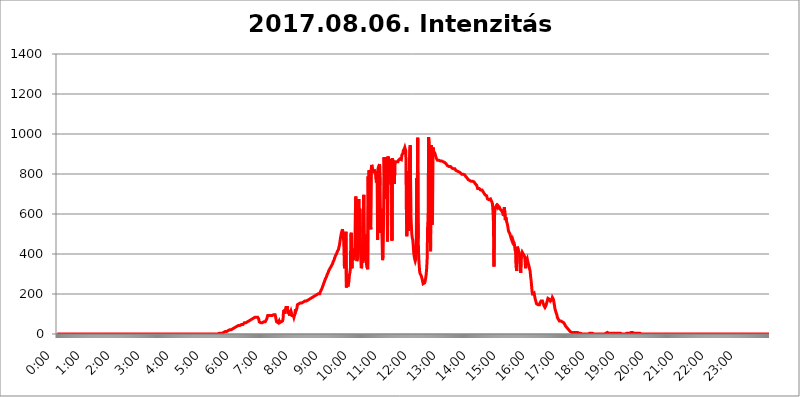
| Category | 2017.08.06. Intenzitás [W/m^2] |
|---|---|
| 0.0 | 0 |
| 0.0006944444444444445 | 0 |
| 0.001388888888888889 | 0 |
| 0.0020833333333333333 | 0 |
| 0.002777777777777778 | 0 |
| 0.003472222222222222 | 0 |
| 0.004166666666666667 | 0 |
| 0.004861111111111111 | 0 |
| 0.005555555555555556 | 0 |
| 0.0062499999999999995 | 0 |
| 0.006944444444444444 | 0 |
| 0.007638888888888889 | 0 |
| 0.008333333333333333 | 0 |
| 0.009027777777777779 | 0 |
| 0.009722222222222222 | 0 |
| 0.010416666666666666 | 0 |
| 0.011111111111111112 | 0 |
| 0.011805555555555555 | 0 |
| 0.012499999999999999 | 0 |
| 0.013194444444444444 | 0 |
| 0.013888888888888888 | 0 |
| 0.014583333333333332 | 0 |
| 0.015277777777777777 | 0 |
| 0.015972222222222224 | 0 |
| 0.016666666666666666 | 0 |
| 0.017361111111111112 | 0 |
| 0.018055555555555557 | 0 |
| 0.01875 | 0 |
| 0.019444444444444445 | 0 |
| 0.02013888888888889 | 0 |
| 0.020833333333333332 | 0 |
| 0.02152777777777778 | 0 |
| 0.022222222222222223 | 0 |
| 0.02291666666666667 | 0 |
| 0.02361111111111111 | 0 |
| 0.024305555555555556 | 0 |
| 0.024999999999999998 | 0 |
| 0.025694444444444447 | 0 |
| 0.02638888888888889 | 0 |
| 0.027083333333333334 | 0 |
| 0.027777777777777776 | 0 |
| 0.02847222222222222 | 0 |
| 0.029166666666666664 | 0 |
| 0.029861111111111113 | 0 |
| 0.030555555555555555 | 0 |
| 0.03125 | 0 |
| 0.03194444444444445 | 0 |
| 0.03263888888888889 | 0 |
| 0.03333333333333333 | 0 |
| 0.034027777777777775 | 0 |
| 0.034722222222222224 | 0 |
| 0.035416666666666666 | 0 |
| 0.036111111111111115 | 0 |
| 0.03680555555555556 | 0 |
| 0.0375 | 0 |
| 0.03819444444444444 | 0 |
| 0.03888888888888889 | 0 |
| 0.03958333333333333 | 0 |
| 0.04027777777777778 | 0 |
| 0.04097222222222222 | 0 |
| 0.041666666666666664 | 0 |
| 0.042361111111111106 | 0 |
| 0.04305555555555556 | 0 |
| 0.043750000000000004 | 0 |
| 0.044444444444444446 | 0 |
| 0.04513888888888889 | 0 |
| 0.04583333333333334 | 0 |
| 0.04652777777777778 | 0 |
| 0.04722222222222222 | 0 |
| 0.04791666666666666 | 0 |
| 0.04861111111111111 | 0 |
| 0.049305555555555554 | 0 |
| 0.049999999999999996 | 0 |
| 0.05069444444444445 | 0 |
| 0.051388888888888894 | 0 |
| 0.052083333333333336 | 0 |
| 0.05277777777777778 | 0 |
| 0.05347222222222222 | 0 |
| 0.05416666666666667 | 0 |
| 0.05486111111111111 | 0 |
| 0.05555555555555555 | 0 |
| 0.05625 | 0 |
| 0.05694444444444444 | 0 |
| 0.057638888888888885 | 0 |
| 0.05833333333333333 | 0 |
| 0.05902777777777778 | 0 |
| 0.059722222222222225 | 0 |
| 0.06041666666666667 | 0 |
| 0.061111111111111116 | 0 |
| 0.06180555555555556 | 0 |
| 0.0625 | 0 |
| 0.06319444444444444 | 0 |
| 0.06388888888888888 | 0 |
| 0.06458333333333334 | 0 |
| 0.06527777777777778 | 0 |
| 0.06597222222222222 | 0 |
| 0.06666666666666667 | 0 |
| 0.06736111111111111 | 0 |
| 0.06805555555555555 | 0 |
| 0.06874999999999999 | 0 |
| 0.06944444444444443 | 0 |
| 0.07013888888888889 | 0 |
| 0.07083333333333333 | 0 |
| 0.07152777777777779 | 0 |
| 0.07222222222222223 | 0 |
| 0.07291666666666667 | 0 |
| 0.07361111111111111 | 0 |
| 0.07430555555555556 | 0 |
| 0.075 | 0 |
| 0.07569444444444444 | 0 |
| 0.0763888888888889 | 0 |
| 0.07708333333333334 | 0 |
| 0.07777777777777778 | 0 |
| 0.07847222222222222 | 0 |
| 0.07916666666666666 | 0 |
| 0.0798611111111111 | 0 |
| 0.08055555555555556 | 0 |
| 0.08125 | 0 |
| 0.08194444444444444 | 0 |
| 0.08263888888888889 | 0 |
| 0.08333333333333333 | 0 |
| 0.08402777777777777 | 0 |
| 0.08472222222222221 | 0 |
| 0.08541666666666665 | 0 |
| 0.08611111111111112 | 0 |
| 0.08680555555555557 | 0 |
| 0.08750000000000001 | 0 |
| 0.08819444444444445 | 0 |
| 0.08888888888888889 | 0 |
| 0.08958333333333333 | 0 |
| 0.09027777777777778 | 0 |
| 0.09097222222222222 | 0 |
| 0.09166666666666667 | 0 |
| 0.09236111111111112 | 0 |
| 0.09305555555555556 | 0 |
| 0.09375 | 0 |
| 0.09444444444444444 | 0 |
| 0.09513888888888888 | 0 |
| 0.09583333333333333 | 0 |
| 0.09652777777777777 | 0 |
| 0.09722222222222222 | 0 |
| 0.09791666666666667 | 0 |
| 0.09861111111111111 | 0 |
| 0.09930555555555555 | 0 |
| 0.09999999999999999 | 0 |
| 0.10069444444444443 | 0 |
| 0.1013888888888889 | 0 |
| 0.10208333333333335 | 0 |
| 0.10277777777777779 | 0 |
| 0.10347222222222223 | 0 |
| 0.10416666666666667 | 0 |
| 0.10486111111111111 | 0 |
| 0.10555555555555556 | 0 |
| 0.10625 | 0 |
| 0.10694444444444444 | 0 |
| 0.1076388888888889 | 0 |
| 0.10833333333333334 | 0 |
| 0.10902777777777778 | 0 |
| 0.10972222222222222 | 0 |
| 0.1111111111111111 | 0 |
| 0.11180555555555556 | 0 |
| 0.11180555555555556 | 0 |
| 0.1125 | 0 |
| 0.11319444444444444 | 0 |
| 0.11388888888888889 | 0 |
| 0.11458333333333333 | 0 |
| 0.11527777777777777 | 0 |
| 0.11597222222222221 | 0 |
| 0.11666666666666665 | 0 |
| 0.1173611111111111 | 0 |
| 0.11805555555555557 | 0 |
| 0.11944444444444445 | 0 |
| 0.12013888888888889 | 0 |
| 0.12083333333333333 | 0 |
| 0.12152777777777778 | 0 |
| 0.12222222222222223 | 0 |
| 0.12291666666666667 | 0 |
| 0.12291666666666667 | 0 |
| 0.12361111111111112 | 0 |
| 0.12430555555555556 | 0 |
| 0.125 | 0 |
| 0.12569444444444444 | 0 |
| 0.12638888888888888 | 0 |
| 0.12708333333333333 | 0 |
| 0.16875 | 0 |
| 0.12847222222222224 | 0 |
| 0.12916666666666668 | 0 |
| 0.12986111111111112 | 0 |
| 0.13055555555555556 | 0 |
| 0.13125 | 0 |
| 0.13194444444444445 | 0 |
| 0.1326388888888889 | 0 |
| 0.13333333333333333 | 0 |
| 0.13402777777777777 | 0 |
| 0.13402777777777777 | 0 |
| 0.13472222222222222 | 0 |
| 0.13541666666666666 | 0 |
| 0.1361111111111111 | 0 |
| 0.13749999999999998 | 0 |
| 0.13819444444444443 | 0 |
| 0.1388888888888889 | 0 |
| 0.13958333333333334 | 0 |
| 0.14027777777777778 | 0 |
| 0.14097222222222222 | 0 |
| 0.14166666666666666 | 0 |
| 0.1423611111111111 | 0 |
| 0.14305555555555557 | 0 |
| 0.14375000000000002 | 0 |
| 0.14444444444444446 | 0 |
| 0.1451388888888889 | 0 |
| 0.1451388888888889 | 0 |
| 0.14652777777777778 | 0 |
| 0.14722222222222223 | 0 |
| 0.14791666666666667 | 0 |
| 0.1486111111111111 | 0 |
| 0.14930555555555555 | 0 |
| 0.15 | 0 |
| 0.15069444444444444 | 0 |
| 0.15138888888888888 | 0 |
| 0.15208333333333332 | 0 |
| 0.15277777777777776 | 0 |
| 0.15347222222222223 | 0 |
| 0.15416666666666667 | 0 |
| 0.15486111111111112 | 0 |
| 0.15555555555555556 | 0 |
| 0.15625 | 0 |
| 0.15694444444444444 | 0 |
| 0.15763888888888888 | 0 |
| 0.15833333333333333 | 0 |
| 0.15902777777777777 | 0 |
| 0.15972222222222224 | 0 |
| 0.16041666666666668 | 0 |
| 0.16111111111111112 | 0 |
| 0.16180555555555556 | 0 |
| 0.1625 | 0 |
| 0.16319444444444445 | 0 |
| 0.1638888888888889 | 0 |
| 0.16458333333333333 | 0 |
| 0.16527777777777777 | 0 |
| 0.16597222222222222 | 0 |
| 0.16666666666666666 | 0 |
| 0.1673611111111111 | 0 |
| 0.16805555555555554 | 0 |
| 0.16874999999999998 | 0 |
| 0.16944444444444443 | 0 |
| 0.17013888888888887 | 0 |
| 0.1708333333333333 | 0 |
| 0.17152777777777775 | 0 |
| 0.17222222222222225 | 0 |
| 0.1729166666666667 | 0 |
| 0.17361111111111113 | 0 |
| 0.17430555555555557 | 0 |
| 0.17500000000000002 | 0 |
| 0.17569444444444446 | 0 |
| 0.1763888888888889 | 0 |
| 0.17708333333333334 | 0 |
| 0.17777777777777778 | 0 |
| 0.17847222222222223 | 0 |
| 0.17916666666666667 | 0 |
| 0.1798611111111111 | 0 |
| 0.18055555555555555 | 0 |
| 0.18125 | 0 |
| 0.18194444444444444 | 0 |
| 0.1826388888888889 | 0 |
| 0.18333333333333335 | 0 |
| 0.1840277777777778 | 0 |
| 0.18472222222222223 | 0 |
| 0.18541666666666667 | 0 |
| 0.18611111111111112 | 0 |
| 0.18680555555555556 | 0 |
| 0.1875 | 0 |
| 0.18819444444444444 | 0 |
| 0.18888888888888888 | 0 |
| 0.18958333333333333 | 0 |
| 0.19027777777777777 | 0 |
| 0.1909722222222222 | 0 |
| 0.19166666666666665 | 0 |
| 0.19236111111111112 | 0 |
| 0.19305555555555554 | 0 |
| 0.19375 | 0 |
| 0.19444444444444445 | 0 |
| 0.1951388888888889 | 0 |
| 0.19583333333333333 | 0 |
| 0.19652777777777777 | 0 |
| 0.19722222222222222 | 0 |
| 0.19791666666666666 | 0 |
| 0.1986111111111111 | 0 |
| 0.19930555555555554 | 0 |
| 0.19999999999999998 | 0 |
| 0.20069444444444443 | 0 |
| 0.20138888888888887 | 0 |
| 0.2020833333333333 | 0 |
| 0.2027777777777778 | 0 |
| 0.2034722222222222 | 0 |
| 0.2041666666666667 | 0 |
| 0.20486111111111113 | 0 |
| 0.20555555555555557 | 0 |
| 0.20625000000000002 | 0 |
| 0.20694444444444446 | 0 |
| 0.2076388888888889 | 0 |
| 0.20833333333333334 | 0 |
| 0.20902777777777778 | 0 |
| 0.20972222222222223 | 0 |
| 0.21041666666666667 | 0 |
| 0.2111111111111111 | 0 |
| 0.21180555555555555 | 0 |
| 0.2125 | 0 |
| 0.21319444444444444 | 0 |
| 0.2138888888888889 | 0 |
| 0.21458333333333335 | 0 |
| 0.2152777777777778 | 0 |
| 0.21597222222222223 | 0 |
| 0.21666666666666667 | 0 |
| 0.21736111111111112 | 0 |
| 0.21805555555555556 | 0 |
| 0.21875 | 0 |
| 0.21944444444444444 | 0 |
| 0.22013888888888888 | 0 |
| 0.22083333333333333 | 0 |
| 0.22152777777777777 | 0 |
| 0.2222222222222222 | 0 |
| 0.22291666666666665 | 0 |
| 0.2236111111111111 | 0 |
| 0.22430555555555556 | 0 |
| 0.225 | 0 |
| 0.22569444444444445 | 0 |
| 0.2263888888888889 | 3.525 |
| 0.22708333333333333 | 3.525 |
| 0.22777777777777777 | 3.525 |
| 0.22847222222222222 | 3.525 |
| 0.22916666666666666 | 3.525 |
| 0.2298611111111111 | 3.525 |
| 0.23055555555555554 | 3.525 |
| 0.23124999999999998 | 3.525 |
| 0.23194444444444443 | 3.525 |
| 0.23263888888888887 | 7.887 |
| 0.2333333333333333 | 7.887 |
| 0.2340277777777778 | 7.887 |
| 0.2347222222222222 | 7.887 |
| 0.2354166666666667 | 12.257 |
| 0.23611111111111113 | 12.257 |
| 0.23680555555555557 | 12.257 |
| 0.23750000000000002 | 12.257 |
| 0.23819444444444446 | 12.257 |
| 0.2388888888888889 | 12.257 |
| 0.23958333333333334 | 16.636 |
| 0.24027777777777778 | 16.636 |
| 0.24097222222222223 | 16.636 |
| 0.24166666666666667 | 21.024 |
| 0.2423611111111111 | 21.024 |
| 0.24305555555555555 | 21.024 |
| 0.24375 | 21.024 |
| 0.24444444444444446 | 21.024 |
| 0.24513888888888888 | 25.419 |
| 0.24583333333333335 | 25.419 |
| 0.2465277777777778 | 25.419 |
| 0.24722222222222223 | 25.419 |
| 0.24791666666666667 | 29.823 |
| 0.24861111111111112 | 29.823 |
| 0.24930555555555556 | 34.234 |
| 0.25 | 34.234 |
| 0.25069444444444444 | 34.234 |
| 0.2513888888888889 | 38.653 |
| 0.2520833333333333 | 38.653 |
| 0.25277777777777777 | 38.653 |
| 0.2534722222222222 | 43.079 |
| 0.25416666666666665 | 43.079 |
| 0.2548611111111111 | 43.079 |
| 0.2555555555555556 | 43.079 |
| 0.25625000000000003 | 43.079 |
| 0.2569444444444445 | 47.511 |
| 0.2576388888888889 | 47.511 |
| 0.25833333333333336 | 47.511 |
| 0.2590277777777778 | 47.511 |
| 0.25972222222222224 | 47.511 |
| 0.2604166666666667 | 47.511 |
| 0.2611111111111111 | 51.951 |
| 0.26180555555555557 | 51.951 |
| 0.2625 | 56.398 |
| 0.26319444444444445 | 56.398 |
| 0.2638888888888889 | 56.398 |
| 0.26458333333333334 | 56.398 |
| 0.2652777777777778 | 60.85 |
| 0.2659722222222222 | 60.85 |
| 0.26666666666666666 | 60.85 |
| 0.2673611111111111 | 60.85 |
| 0.26805555555555555 | 65.31 |
| 0.26875 | 65.31 |
| 0.26944444444444443 | 65.31 |
| 0.2701388888888889 | 69.775 |
| 0.2708333333333333 | 69.775 |
| 0.27152777777777776 | 69.775 |
| 0.2722222222222222 | 74.246 |
| 0.27291666666666664 | 74.246 |
| 0.2736111111111111 | 74.246 |
| 0.2743055555555555 | 78.722 |
| 0.27499999999999997 | 78.722 |
| 0.27569444444444446 | 78.722 |
| 0.27638888888888885 | 83.205 |
| 0.27708333333333335 | 83.205 |
| 0.2777777777777778 | 83.205 |
| 0.27847222222222223 | 83.205 |
| 0.2791666666666667 | 83.205 |
| 0.2798611111111111 | 83.205 |
| 0.28055555555555556 | 83.205 |
| 0.28125 | 83.205 |
| 0.28194444444444444 | 83.205 |
| 0.2826388888888889 | 74.246 |
| 0.2833333333333333 | 60.85 |
| 0.28402777777777777 | 56.398 |
| 0.2847222222222222 | 56.398 |
| 0.28541666666666665 | 56.398 |
| 0.28611111111111115 | 56.398 |
| 0.28680555555555554 | 56.398 |
| 0.28750000000000003 | 56.398 |
| 0.2881944444444445 | 56.398 |
| 0.2888888888888889 | 56.398 |
| 0.28958333333333336 | 60.85 |
| 0.2902777777777778 | 60.85 |
| 0.29097222222222224 | 60.85 |
| 0.2916666666666667 | 60.85 |
| 0.2923611111111111 | 60.85 |
| 0.29305555555555557 | 60.85 |
| 0.29375 | 74.246 |
| 0.29444444444444445 | 69.775 |
| 0.2951388888888889 | 92.184 |
| 0.29583333333333334 | 92.184 |
| 0.2965277777777778 | 92.184 |
| 0.2972222222222222 | 92.184 |
| 0.29791666666666666 | 92.184 |
| 0.2986111111111111 | 92.184 |
| 0.29930555555555555 | 92.184 |
| 0.3 | 92.184 |
| 0.30069444444444443 | 92.184 |
| 0.3013888888888889 | 92.184 |
| 0.3020833333333333 | 96.682 |
| 0.30277777777777776 | 96.682 |
| 0.3034722222222222 | 96.682 |
| 0.30416666666666664 | 96.682 |
| 0.3048611111111111 | 96.682 |
| 0.3055555555555555 | 96.682 |
| 0.30624999999999997 | 92.184 |
| 0.3069444444444444 | 92.184 |
| 0.3076388888888889 | 60.85 |
| 0.30833333333333335 | 56.398 |
| 0.3090277777777778 | 56.398 |
| 0.30972222222222223 | 56.398 |
| 0.3104166666666667 | 56.398 |
| 0.3111111111111111 | 65.31 |
| 0.31180555555555556 | 56.398 |
| 0.3125 | 56.398 |
| 0.31319444444444444 | 60.85 |
| 0.3138888888888889 | 60.85 |
| 0.3145833333333333 | 65.31 |
| 0.31527777777777777 | 65.31 |
| 0.3159722222222222 | 65.31 |
| 0.31666666666666665 | 74.246 |
| 0.31736111111111115 | 110.201 |
| 0.31805555555555554 | 119.235 |
| 0.31875000000000003 | 101.184 |
| 0.3194444444444445 | 123.758 |
| 0.3201388888888889 | 114.716 |
| 0.32083333333333336 | 132.814 |
| 0.3215277777777778 | 132.814 |
| 0.32222222222222224 | 137.347 |
| 0.3229166666666667 | 132.814 |
| 0.3236111111111111 | 101.184 |
| 0.32430555555555557 | 110.201 |
| 0.325 | 119.235 |
| 0.32569444444444445 | 92.184 |
| 0.3263888888888889 | 92.184 |
| 0.32708333333333334 | 92.184 |
| 0.3277777777777778 | 114.716 |
| 0.3284722222222222 | 105.69 |
| 0.32916666666666666 | 92.184 |
| 0.3298611111111111 | 92.184 |
| 0.33055555555555555 | 87.692 |
| 0.33125 | 92.184 |
| 0.33194444444444443 | 83.205 |
| 0.3326388888888889 | 87.692 |
| 0.3333333333333333 | 101.184 |
| 0.3340277777777778 | 123.758 |
| 0.3347222222222222 | 114.716 |
| 0.3354166666666667 | 114.716 |
| 0.3361111111111111 | 128.284 |
| 0.3368055555555556 | 146.423 |
| 0.33749999999999997 | 146.423 |
| 0.33819444444444446 | 150.964 |
| 0.33888888888888885 | 150.964 |
| 0.33958333333333335 | 150.964 |
| 0.34027777777777773 | 150.964 |
| 0.34097222222222223 | 155.509 |
| 0.3416666666666666 | 155.509 |
| 0.3423611111111111 | 155.509 |
| 0.3430555555555555 | 155.509 |
| 0.34375 | 155.509 |
| 0.3444444444444445 | 155.509 |
| 0.3451388888888889 | 160.056 |
| 0.3458333333333334 | 160.056 |
| 0.34652777777777777 | 160.056 |
| 0.34722222222222227 | 164.605 |
| 0.34791666666666665 | 164.605 |
| 0.34861111111111115 | 164.605 |
| 0.34930555555555554 | 164.605 |
| 0.35000000000000003 | 169.156 |
| 0.3506944444444444 | 169.156 |
| 0.3513888888888889 | 169.156 |
| 0.3520833333333333 | 173.709 |
| 0.3527777777777778 | 173.709 |
| 0.3534722222222222 | 173.709 |
| 0.3541666666666667 | 173.709 |
| 0.3548611111111111 | 178.264 |
| 0.35555555555555557 | 178.264 |
| 0.35625 | 178.264 |
| 0.35694444444444445 | 182.82 |
| 0.3576388888888889 | 182.82 |
| 0.35833333333333334 | 182.82 |
| 0.3590277777777778 | 182.82 |
| 0.3597222222222222 | 187.378 |
| 0.36041666666666666 | 187.378 |
| 0.3611111111111111 | 187.378 |
| 0.36180555555555555 | 191.937 |
| 0.3625 | 191.937 |
| 0.36319444444444443 | 191.937 |
| 0.3638888888888889 | 196.497 |
| 0.3645833333333333 | 196.497 |
| 0.3652777777777778 | 196.497 |
| 0.3659722222222222 | 201.058 |
| 0.3666666666666667 | 201.058 |
| 0.3673611111111111 | 201.058 |
| 0.3680555555555556 | 201.058 |
| 0.36874999999999997 | 205.62 |
| 0.36944444444444446 | 214.746 |
| 0.37013888888888885 | 219.309 |
| 0.37083333333333335 | 223.873 |
| 0.37152777777777773 | 228.436 |
| 0.37222222222222223 | 237.564 |
| 0.3729166666666666 | 242.127 |
| 0.3736111111111111 | 251.251 |
| 0.3743055555555555 | 255.813 |
| 0.375 | 264.932 |
| 0.3756944444444445 | 269.49 |
| 0.3763888888888889 | 278.603 |
| 0.3770833333333334 | 283.156 |
| 0.37777777777777777 | 287.709 |
| 0.37847222222222227 | 296.808 |
| 0.37916666666666665 | 301.354 |
| 0.37986111111111115 | 305.898 |
| 0.38055555555555554 | 314.98 |
| 0.38125000000000003 | 314.98 |
| 0.3819444444444444 | 324.052 |
| 0.3826388888888889 | 328.584 |
| 0.3833333333333333 | 333.113 |
| 0.3840277777777778 | 337.639 |
| 0.3847222222222222 | 342.162 |
| 0.3854166666666667 | 346.682 |
| 0.3861111111111111 | 351.198 |
| 0.38680555555555557 | 360.221 |
| 0.3875 | 364.728 |
| 0.38819444444444445 | 369.23 |
| 0.3888888888888889 | 378.224 |
| 0.38958333333333334 | 382.715 |
| 0.3902777777777778 | 391.685 |
| 0.3909722222222222 | 396.164 |
| 0.39166666666666666 | 400.638 |
| 0.3923611111111111 | 405.108 |
| 0.39305555555555555 | 414.035 |
| 0.39375 | 418.492 |
| 0.39444444444444443 | 422.943 |
| 0.3951388888888889 | 436.27 |
| 0.3958333333333333 | 445.129 |
| 0.3965277777777778 | 462.786 |
| 0.3972222222222222 | 480.356 |
| 0.3979166666666667 | 493.475 |
| 0.3986111111111111 | 506.542 |
| 0.3993055555555556 | 515.223 |
| 0.39999999999999997 | 523.88 |
| 0.40069444444444446 | 528.2 |
| 0.40138888888888885 | 489.108 |
| 0.40208333333333335 | 431.833 |
| 0.40277777777777773 | 328.584 |
| 0.40347222222222223 | 333.113 |
| 0.4041666666666666 | 422.943 |
| 0.4048611111111111 | 510.885 |
| 0.4055555555555555 | 233 |
| 0.40625 | 278.603 |
| 0.4069444444444445 | 260.373 |
| 0.4076388888888889 | 237.564 |
| 0.4083333333333334 | 242.127 |
| 0.40902777777777777 | 264.932 |
| 0.40972222222222227 | 292.259 |
| 0.41041666666666665 | 305.898 |
| 0.41111111111111115 | 324.052 |
| 0.41180555555555554 | 497.836 |
| 0.41250000000000003 | 506.542 |
| 0.4131944444444444 | 328.584 |
| 0.4138888888888889 | 400.638 |
| 0.4145833333333333 | 427.39 |
| 0.4152777777777778 | 369.23 |
| 0.4159722222222222 | 414.035 |
| 0.4166666666666667 | 387.202 |
| 0.4173611111111111 | 414.035 |
| 0.41805555555555557 | 592.233 |
| 0.41875 | 687.544 |
| 0.41944444444444445 | 405.108 |
| 0.4201388888888889 | 364.728 |
| 0.42083333333333334 | 369.23 |
| 0.4215277777777778 | 387.202 |
| 0.4222222222222222 | 405.108 |
| 0.42291666666666666 | 675.311 |
| 0.4236111111111111 | 418.492 |
| 0.42430555555555555 | 625.784 |
| 0.425 | 502.192 |
| 0.42569444444444443 | 378.224 |
| 0.4263888888888889 | 328.584 |
| 0.4270833333333333 | 337.639 |
| 0.4277777777777778 | 405.108 |
| 0.4284722222222222 | 355.712 |
| 0.4291666666666667 | 360.221 |
| 0.4298611111111111 | 695.666 |
| 0.4305555555555556 | 382.715 |
| 0.43124999999999997 | 364.728 |
| 0.43194444444444446 | 414.035 |
| 0.43263888888888885 | 497.836 |
| 0.43333333333333335 | 378.224 |
| 0.43402777777777773 | 337.639 |
| 0.43472222222222223 | 342.162 |
| 0.4354166666666666 | 324.052 |
| 0.4361111111111111 | 787.258 |
| 0.4368055555555555 | 609.062 |
| 0.4375 | 818.392 |
| 0.4381944444444445 | 600.661 |
| 0.4388888888888889 | 650.667 |
| 0.4395833333333334 | 523.88 |
| 0.44027777777777777 | 822.26 |
| 0.44097222222222227 | 845.365 |
| 0.44166666666666665 | 837.682 |
| 0.44236111111111115 | 826.123 |
| 0.44305555555555554 | 814.519 |
| 0.44375000000000003 | 806.757 |
| 0.4444444444444444 | 822.26 |
| 0.4451388888888889 | 814.519 |
| 0.4458333333333333 | 802.868 |
| 0.4465277777777778 | 814.519 |
| 0.4472222222222222 | 775.492 |
| 0.4479166666666667 | 771.559 |
| 0.4486111111111111 | 783.342 |
| 0.44930555555555557 | 471.582 |
| 0.45 | 826.123 |
| 0.45069444444444445 | 837.682 |
| 0.4513888888888889 | 841.526 |
| 0.45208333333333334 | 849.199 |
| 0.4527777777777778 | 743.859 |
| 0.4534722222222222 | 506.542 |
| 0.45416666666666666 | 625.784 |
| 0.4548611111111111 | 558.261 |
| 0.45555555555555555 | 475.972 |
| 0.45625 | 369.23 |
| 0.45694444444444443 | 391.685 |
| 0.4576388888888889 | 549.704 |
| 0.4583333333333333 | 883.516 |
| 0.4590277777777778 | 887.309 |
| 0.4597222222222222 | 675.311 |
| 0.4604166666666667 | 883.516 |
| 0.4611111111111111 | 879.719 |
| 0.4618055555555556 | 814.519 |
| 0.46249999999999997 | 767.62 |
| 0.46319444444444446 | 462.786 |
| 0.46388888888888885 | 887.309 |
| 0.46458333333333335 | 875.918 |
| 0.46527777777777773 | 875.918 |
| 0.46597222222222223 | 872.114 |
| 0.4666666666666666 | 868.305 |
| 0.4673611111111111 | 806.757 |
| 0.4680555555555555 | 747.834 |
| 0.46875 | 872.114 |
| 0.4694444444444445 | 467.187 |
| 0.4701388888888889 | 879.719 |
| 0.4708333333333334 | 856.855 |
| 0.47152777777777777 | 864.493 |
| 0.47222222222222227 | 864.493 |
| 0.47291666666666665 | 751.803 |
| 0.47361111111111115 | 860.676 |
| 0.47430555555555554 | 860.676 |
| 0.47500000000000003 | 860.676 |
| 0.4756944444444444 | 860.676 |
| 0.4763888888888889 | 860.676 |
| 0.4770833333333333 | 860.676 |
| 0.4777777777777778 | 860.676 |
| 0.4784722222222222 | 868.305 |
| 0.4791666666666667 | 868.305 |
| 0.4798611111111111 | 868.305 |
| 0.48055555555555557 | 875.918 |
| 0.48125 | 875.918 |
| 0.48194444444444445 | 875.918 |
| 0.4826388888888889 | 872.114 |
| 0.48333333333333334 | 894.885 |
| 0.4840277777777778 | 898.668 |
| 0.4847222222222222 | 902.447 |
| 0.48541666666666666 | 917.534 |
| 0.4861111111111111 | 921.298 |
| 0.48680555555555555 | 925.06 |
| 0.4875 | 932.576 |
| 0.48819444444444443 | 928.819 |
| 0.4888888888888889 | 913.766 |
| 0.4895833333333333 | 638.256 |
| 0.4902777777777778 | 489.108 |
| 0.4909722222222222 | 671.22 |
| 0.4916666666666667 | 814.519 |
| 0.4923611111111111 | 515.223 |
| 0.4930555555555556 | 553.986 |
| 0.49374999999999997 | 829.981 |
| 0.49444444444444446 | 925.06 |
| 0.49513888888888885 | 943.832 |
| 0.49583333333333335 | 609.062 |
| 0.49652777777777773 | 553.986 |
| 0.49722222222222223 | 502.192 |
| 0.4979166666666666 | 480.356 |
| 0.4986111111111111 | 471.582 |
| 0.4993055555555555 | 440.702 |
| 0.5 | 405.108 |
| 0.5006944444444444 | 387.202 |
| 0.5013888888888889 | 373.729 |
| 0.5020833333333333 | 364.728 |
| 0.5027777777777778 | 373.729 |
| 0.5034722222222222 | 405.108 |
| 0.5041666666666667 | 779.42 |
| 0.5048611111111111 | 613.252 |
| 0.5055555555555555 | 981.244 |
| 0.50625 | 475.972 |
| 0.5069444444444444 | 382.715 |
| 0.5076388888888889 | 342.162 |
| 0.5083333333333333 | 310.44 |
| 0.5090277777777777 | 301.354 |
| 0.5097222222222222 | 305.898 |
| 0.5104166666666666 | 292.259 |
| 0.5111111111111112 | 283.156 |
| 0.5118055555555555 | 274.047 |
| 0.5125000000000001 | 269.49 |
| 0.5131944444444444 | 251.251 |
| 0.513888888888889 | 246.689 |
| 0.5145833333333333 | 251.251 |
| 0.5152777777777778 | 255.813 |
| 0.5159722222222222 | 264.932 |
| 0.5166666666666667 | 278.603 |
| 0.517361111111111 | 296.808 |
| 0.5180555555555556 | 324.052 |
| 0.5187499999999999 | 369.23 |
| 0.5194444444444445 | 532.513 |
| 0.5201388888888888 | 583.779 |
| 0.5208333333333334 | 984.98 |
| 0.5215277777777778 | 951.327 |
| 0.5222222222222223 | 936.33 |
| 0.5229166666666667 | 879.719 |
| 0.5236111111111111 | 414.035 |
| 0.5243055555555556 | 943.832 |
| 0.525 | 932.576 |
| 0.5256944444444445 | 545.416 |
| 0.5263888888888889 | 609.062 |
| 0.5270833333333333 | 932.576 |
| 0.5277777777777778 | 917.534 |
| 0.5284722222222222 | 909.996 |
| 0.5291666666666667 | 909.996 |
| 0.5298611111111111 | 902.447 |
| 0.5305555555555556 | 891.099 |
| 0.53125 | 883.516 |
| 0.5319444444444444 | 875.918 |
| 0.5326388888888889 | 875.918 |
| 0.5333333333333333 | 868.305 |
| 0.5340277777777778 | 868.305 |
| 0.5347222222222222 | 868.305 |
| 0.5354166666666667 | 868.305 |
| 0.5361111111111111 | 868.305 |
| 0.5368055555555555 | 864.493 |
| 0.5375 | 864.493 |
| 0.5381944444444444 | 864.493 |
| 0.5388888888888889 | 864.493 |
| 0.5395833333333333 | 864.493 |
| 0.5402777777777777 | 860.676 |
| 0.5409722222222222 | 860.676 |
| 0.5416666666666666 | 860.676 |
| 0.5423611111111112 | 860.676 |
| 0.5430555555555555 | 856.855 |
| 0.5437500000000001 | 856.855 |
| 0.5444444444444444 | 853.029 |
| 0.545138888888889 | 853.029 |
| 0.5458333333333333 | 849.199 |
| 0.5465277777777778 | 845.365 |
| 0.5472222222222222 | 841.526 |
| 0.5479166666666667 | 841.526 |
| 0.548611111111111 | 837.682 |
| 0.5493055555555556 | 837.682 |
| 0.5499999999999999 | 837.682 |
| 0.5506944444444445 | 841.526 |
| 0.5513888888888888 | 837.682 |
| 0.5520833333333334 | 837.682 |
| 0.5527777777777778 | 833.834 |
| 0.5534722222222223 | 829.981 |
| 0.5541666666666667 | 829.981 |
| 0.5548611111111111 | 829.981 |
| 0.5555555555555556 | 826.123 |
| 0.55625 | 826.123 |
| 0.5569444444444445 | 826.123 |
| 0.5576388888888889 | 826.123 |
| 0.5583333333333333 | 822.26 |
| 0.5590277777777778 | 818.392 |
| 0.5597222222222222 | 818.392 |
| 0.5604166666666667 | 814.519 |
| 0.5611111111111111 | 814.519 |
| 0.5618055555555556 | 814.519 |
| 0.5625 | 810.641 |
| 0.5631944444444444 | 810.641 |
| 0.5638888888888889 | 810.641 |
| 0.5645833333333333 | 810.641 |
| 0.5652777777777778 | 806.757 |
| 0.5659722222222222 | 802.868 |
| 0.5666666666666667 | 802.868 |
| 0.5673611111111111 | 798.974 |
| 0.5680555555555555 | 798.974 |
| 0.56875 | 798.974 |
| 0.5694444444444444 | 798.974 |
| 0.5701388888888889 | 798.974 |
| 0.5708333333333333 | 798.974 |
| 0.5715277777777777 | 795.074 |
| 0.5722222222222222 | 791.169 |
| 0.5729166666666666 | 787.258 |
| 0.5736111111111112 | 783.342 |
| 0.5743055555555555 | 783.342 |
| 0.5750000000000001 | 779.42 |
| 0.5756944444444444 | 775.492 |
| 0.576388888888889 | 771.559 |
| 0.5770833333333333 | 767.62 |
| 0.5777777777777778 | 767.62 |
| 0.5784722222222222 | 767.62 |
| 0.5791666666666667 | 763.674 |
| 0.579861111111111 | 763.674 |
| 0.5805555555555556 | 763.674 |
| 0.5812499999999999 | 763.674 |
| 0.5819444444444445 | 763.674 |
| 0.5826388888888888 | 763.674 |
| 0.5833333333333334 | 763.674 |
| 0.5840277777777778 | 759.723 |
| 0.5847222222222223 | 759.723 |
| 0.5854166666666667 | 755.766 |
| 0.5861111111111111 | 751.803 |
| 0.5868055555555556 | 747.834 |
| 0.5875 | 747.834 |
| 0.5881944444444445 | 743.859 |
| 0.5888888888888889 | 735.89 |
| 0.5895833333333333 | 727.896 |
| 0.5902777777777778 | 727.896 |
| 0.5909722222222222 | 727.896 |
| 0.5916666666666667 | 727.896 |
| 0.5923611111111111 | 723.889 |
| 0.5930555555555556 | 723.889 |
| 0.59375 | 719.877 |
| 0.5944444444444444 | 719.877 |
| 0.5951388888888889 | 719.877 |
| 0.5958333333333333 | 719.877 |
| 0.5965277777777778 | 715.858 |
| 0.5972222222222222 | 711.832 |
| 0.5979166666666667 | 707.8 |
| 0.5986111111111111 | 703.762 |
| 0.5993055555555555 | 699.717 |
| 0.6 | 695.666 |
| 0.6006944444444444 | 691.608 |
| 0.6013888888888889 | 695.666 |
| 0.6020833333333333 | 691.608 |
| 0.6027777777777777 | 687.544 |
| 0.6034722222222222 | 675.311 |
| 0.6041666666666666 | 675.311 |
| 0.6048611111111112 | 675.311 |
| 0.6055555555555555 | 671.22 |
| 0.6062500000000001 | 671.22 |
| 0.6069444444444444 | 675.311 |
| 0.607638888888889 | 675.311 |
| 0.6083333333333333 | 675.311 |
| 0.6090277777777778 | 671.22 |
| 0.6097222222222222 | 658.909 |
| 0.6104166666666667 | 650.667 |
| 0.611111111111111 | 613.252 |
| 0.6118055555555556 | 558.261 |
| 0.6124999999999999 | 337.639 |
| 0.6131944444444445 | 583.779 |
| 0.6138888888888888 | 621.613 |
| 0.6145833333333334 | 634.105 |
| 0.6152777777777778 | 634.105 |
| 0.6159722222222223 | 642.4 |
| 0.6166666666666667 | 638.256 |
| 0.6173611111111111 | 634.105 |
| 0.6180555555555556 | 642.4 |
| 0.61875 | 638.256 |
| 0.6194444444444445 | 638.256 |
| 0.6201388888888889 | 634.105 |
| 0.6208333333333333 | 625.784 |
| 0.6215277777777778 | 629.948 |
| 0.6222222222222222 | 629.948 |
| 0.6229166666666667 | 617.436 |
| 0.6236111111111111 | 617.436 |
| 0.6243055555555556 | 617.436 |
| 0.625 | 604.864 |
| 0.6256944444444444 | 592.233 |
| 0.6263888888888889 | 621.613 |
| 0.6270833333333333 | 634.105 |
| 0.6277777777777778 | 634.105 |
| 0.6284722222222222 | 571.049 |
| 0.6291666666666667 | 583.779 |
| 0.6298611111111111 | 566.793 |
| 0.6305555555555555 | 562.53 |
| 0.63125 | 549.704 |
| 0.6319444444444444 | 536.82 |
| 0.6326388888888889 | 519.555 |
| 0.6333333333333333 | 510.885 |
| 0.6340277777777777 | 506.542 |
| 0.6347222222222222 | 502.192 |
| 0.6354166666666666 | 493.475 |
| 0.6361111111111112 | 489.108 |
| 0.6368055555555555 | 475.972 |
| 0.6375000000000001 | 471.582 |
| 0.6381944444444444 | 462.786 |
| 0.638888888888889 | 471.582 |
| 0.6395833333333333 | 462.786 |
| 0.6402777777777778 | 458.38 |
| 0.6409722222222222 | 453.968 |
| 0.6416666666666667 | 449.551 |
| 0.642361111111111 | 414.035 |
| 0.6430555555555556 | 422.943 |
| 0.6437499999999999 | 333.113 |
| 0.6444444444444445 | 314.98 |
| 0.6451388888888888 | 436.27 |
| 0.6458333333333334 | 431.833 |
| 0.6465277777777778 | 422.943 |
| 0.6472222222222223 | 414.035 |
| 0.6479166666666667 | 409.574 |
| 0.6486111111111111 | 396.164 |
| 0.6493055555555556 | 396.164 |
| 0.65 | 305.898 |
| 0.6506944444444445 | 387.202 |
| 0.6513888888888889 | 400.638 |
| 0.6520833333333333 | 409.574 |
| 0.6527777777777778 | 405.108 |
| 0.6534722222222222 | 405.108 |
| 0.6541666666666667 | 396.164 |
| 0.6548611111111111 | 391.685 |
| 0.6555555555555556 | 387.202 |
| 0.65625 | 360.221 |
| 0.6569444444444444 | 328.584 |
| 0.6576388888888889 | 369.23 |
| 0.6583333333333333 | 369.23 |
| 0.6590277777777778 | 378.224 |
| 0.6597222222222222 | 364.728 |
| 0.6604166666666667 | 355.712 |
| 0.6611111111111111 | 355.712 |
| 0.6618055555555555 | 337.639 |
| 0.6625 | 324.052 |
| 0.6631944444444444 | 314.98 |
| 0.6638888888888889 | 287.709 |
| 0.6645833333333333 | 269.49 |
| 0.6652777777777777 | 242.127 |
| 0.6659722222222222 | 210.182 |
| 0.6666666666666666 | 201.058 |
| 0.6673611111111111 | 201.058 |
| 0.6680555555555556 | 196.497 |
| 0.6687500000000001 | 205.62 |
| 0.6694444444444444 | 191.937 |
| 0.6701388888888888 | 178.264 |
| 0.6708333333333334 | 178.264 |
| 0.6715277777777778 | 173.709 |
| 0.6722222222222222 | 150.964 |
| 0.6729166666666666 | 146.423 |
| 0.6736111111111112 | 146.423 |
| 0.6743055555555556 | 146.423 |
| 0.6749999999999999 | 146.423 |
| 0.6756944444444444 | 146.423 |
| 0.6763888888888889 | 146.423 |
| 0.6770833333333334 | 155.509 |
| 0.6777777777777777 | 160.056 |
| 0.6784722222222223 | 164.605 |
| 0.6791666666666667 | 169.156 |
| 0.6798611111111111 | 169.156 |
| 0.6805555555555555 | 164.605 |
| 0.68125 | 155.509 |
| 0.6819444444444445 | 150.964 |
| 0.6826388888888889 | 141.884 |
| 0.6833333333333332 | 137.347 |
| 0.6840277777777778 | 132.814 |
| 0.6847222222222222 | 137.347 |
| 0.6854166666666667 | 141.884 |
| 0.686111111111111 | 150.964 |
| 0.6868055555555556 | 160.056 |
| 0.6875 | 169.156 |
| 0.6881944444444444 | 178.264 |
| 0.688888888888889 | 178.264 |
| 0.6895833333333333 | 178.264 |
| 0.6902777777777778 | 173.709 |
| 0.6909722222222222 | 169.156 |
| 0.6916666666666668 | 164.605 |
| 0.6923611111111111 | 164.605 |
| 0.6930555555555555 | 169.156 |
| 0.69375 | 173.709 |
| 0.6944444444444445 | 182.82 |
| 0.6951388888888889 | 178.264 |
| 0.6958333333333333 | 173.709 |
| 0.6965277777777777 | 160.056 |
| 0.6972222222222223 | 146.423 |
| 0.6979166666666666 | 128.284 |
| 0.6986111111111111 | 119.235 |
| 0.6993055555555556 | 110.201 |
| 0.7000000000000001 | 105.69 |
| 0.7006944444444444 | 96.682 |
| 0.7013888888888888 | 83.205 |
| 0.7020833333333334 | 78.722 |
| 0.7027777777777778 | 74.246 |
| 0.7034722222222222 | 69.775 |
| 0.7041666666666666 | 65.31 |
| 0.7048611111111112 | 65.31 |
| 0.7055555555555556 | 65.31 |
| 0.7062499999999999 | 65.31 |
| 0.7069444444444444 | 65.31 |
| 0.7076388888888889 | 60.85 |
| 0.7083333333333334 | 60.85 |
| 0.7090277777777777 | 60.85 |
| 0.7097222222222223 | 56.398 |
| 0.7104166666666667 | 56.398 |
| 0.7111111111111111 | 51.951 |
| 0.7118055555555555 | 47.511 |
| 0.7125 | 43.079 |
| 0.7131944444444445 | 38.653 |
| 0.7138888888888889 | 34.234 |
| 0.7145833333333332 | 34.234 |
| 0.7152777777777778 | 29.823 |
| 0.7159722222222222 | 29.823 |
| 0.7166666666666667 | 25.419 |
| 0.717361111111111 | 21.024 |
| 0.7180555555555556 | 16.636 |
| 0.71875 | 16.636 |
| 0.7194444444444444 | 12.257 |
| 0.720138888888889 | 12.257 |
| 0.7208333333333333 | 7.887 |
| 0.7215277777777778 | 7.887 |
| 0.7222222222222222 | 7.887 |
| 0.7229166666666668 | 7.887 |
| 0.7236111111111111 | 7.887 |
| 0.7243055555555555 | 7.887 |
| 0.725 | 7.887 |
| 0.7256944444444445 | 7.887 |
| 0.7263888888888889 | 7.887 |
| 0.7270833333333333 | 7.887 |
| 0.7277777777777777 | 7.887 |
| 0.7284722222222223 | 7.887 |
| 0.7291666666666666 | 7.887 |
| 0.7298611111111111 | 7.887 |
| 0.7305555555555556 | 7.887 |
| 0.7312500000000001 | 7.887 |
| 0.7319444444444444 | 3.525 |
| 0.7326388888888888 | 3.525 |
| 0.7333333333333334 | 3.525 |
| 0.7340277777777778 | 3.525 |
| 0.7347222222222222 | 3.525 |
| 0.7354166666666666 | 0 |
| 0.7361111111111112 | 0 |
| 0.7368055555555556 | 0 |
| 0.7374999999999999 | 0 |
| 0.7381944444444444 | 0 |
| 0.7388888888888889 | 0 |
| 0.7395833333333334 | 0 |
| 0.7402777777777777 | 0 |
| 0.7409722222222223 | 0 |
| 0.7416666666666667 | 0 |
| 0.7423611111111111 | 0 |
| 0.7430555555555555 | 0 |
| 0.74375 | 0 |
| 0.7444444444444445 | 0 |
| 0.7451388888888889 | 3.525 |
| 0.7458333333333332 | 3.525 |
| 0.7465277777777778 | 3.525 |
| 0.7472222222222222 | 3.525 |
| 0.7479166666666667 | 3.525 |
| 0.748611111111111 | 3.525 |
| 0.7493055555555556 | 3.525 |
| 0.75 | 3.525 |
| 0.7506944444444444 | 3.525 |
| 0.751388888888889 | 0 |
| 0.7520833333333333 | 0 |
| 0.7527777777777778 | 0 |
| 0.7534722222222222 | 0 |
| 0.7541666666666668 | 0 |
| 0.7548611111111111 | 0 |
| 0.7555555555555555 | 0 |
| 0.75625 | 0 |
| 0.7569444444444445 | 0 |
| 0.7576388888888889 | 0 |
| 0.7583333333333333 | 0 |
| 0.7590277777777777 | 0 |
| 0.7597222222222223 | 0 |
| 0.7604166666666666 | 0 |
| 0.7611111111111111 | 0 |
| 0.7618055555555556 | 0 |
| 0.7625000000000001 | 0 |
| 0.7631944444444444 | 0 |
| 0.7638888888888888 | 0 |
| 0.7645833333333334 | 0 |
| 0.7652777777777778 | 0 |
| 0.7659722222222222 | 0 |
| 0.7666666666666666 | 0 |
| 0.7673611111111112 | 0 |
| 0.7680555555555556 | 3.525 |
| 0.7687499999999999 | 3.525 |
| 0.7694444444444444 | 3.525 |
| 0.7701388888888889 | 3.525 |
| 0.7708333333333334 | 3.525 |
| 0.7715277777777777 | 7.887 |
| 0.7722222222222223 | 7.887 |
| 0.7729166666666667 | 7.887 |
| 0.7736111111111111 | 3.525 |
| 0.7743055555555555 | 3.525 |
| 0.775 | 3.525 |
| 0.7756944444444445 | 3.525 |
| 0.7763888888888889 | 3.525 |
| 0.7770833333333332 | 3.525 |
| 0.7777777777777778 | 3.525 |
| 0.7784722222222222 | 3.525 |
| 0.7791666666666667 | 3.525 |
| 0.779861111111111 | 3.525 |
| 0.7805555555555556 | 3.525 |
| 0.78125 | 3.525 |
| 0.7819444444444444 | 3.525 |
| 0.782638888888889 | 3.525 |
| 0.7833333333333333 | 3.525 |
| 0.7840277777777778 | 3.525 |
| 0.7847222222222222 | 3.525 |
| 0.7854166666666668 | 3.525 |
| 0.7861111111111111 | 3.525 |
| 0.7868055555555555 | 3.525 |
| 0.7875 | 3.525 |
| 0.7881944444444445 | 3.525 |
| 0.7888888888888889 | 0 |
| 0.7895833333333333 | 3.525 |
| 0.7902777777777777 | 3.525 |
| 0.7909722222222223 | 0 |
| 0.7916666666666666 | 0 |
| 0.7923611111111111 | 0 |
| 0.7930555555555556 | 0 |
| 0.7937500000000001 | 0 |
| 0.7944444444444444 | 0 |
| 0.7951388888888888 | 0 |
| 0.7958333333333334 | 0 |
| 0.7965277777777778 | 0 |
| 0.7972222222222222 | 3.525 |
| 0.7979166666666666 | 3.525 |
| 0.7986111111111112 | 3.525 |
| 0.7993055555555556 | 3.525 |
| 0.7999999999999999 | 3.525 |
| 0.8006944444444444 | 3.525 |
| 0.8013888888888889 | 3.525 |
| 0.8020833333333334 | 3.525 |
| 0.8027777777777777 | 3.525 |
| 0.8034722222222223 | 3.525 |
| 0.8041666666666667 | 3.525 |
| 0.8048611111111111 | 7.887 |
| 0.8055555555555555 | 7.887 |
| 0.80625 | 7.887 |
| 0.8069444444444445 | 7.887 |
| 0.8076388888888889 | 7.887 |
| 0.8083333333333332 | 3.525 |
| 0.8090277777777778 | 3.525 |
| 0.8097222222222222 | 3.525 |
| 0.8104166666666667 | 3.525 |
| 0.811111111111111 | 3.525 |
| 0.8118055555555556 | 3.525 |
| 0.8125 | 3.525 |
| 0.8131944444444444 | 3.525 |
| 0.813888888888889 | 3.525 |
| 0.8145833333333333 | 3.525 |
| 0.8152777777777778 | 3.525 |
| 0.8159722222222222 | 3.525 |
| 0.8166666666666668 | 3.525 |
| 0.8173611111111111 | 3.525 |
| 0.8180555555555555 | 0 |
| 0.81875 | 0 |
| 0.8194444444444445 | 0 |
| 0.8201388888888889 | 0 |
| 0.8208333333333333 | 0 |
| 0.8215277777777777 | 0 |
| 0.8222222222222223 | 0 |
| 0.8229166666666666 | 0 |
| 0.8236111111111111 | 0 |
| 0.8243055555555556 | 0 |
| 0.8250000000000001 | 0 |
| 0.8256944444444444 | 0 |
| 0.8263888888888888 | 0 |
| 0.8270833333333334 | 0 |
| 0.8277777777777778 | 0 |
| 0.8284722222222222 | 0 |
| 0.8291666666666666 | 0 |
| 0.8298611111111112 | 0 |
| 0.8305555555555556 | 0 |
| 0.8312499999999999 | 0 |
| 0.8319444444444444 | 0 |
| 0.8326388888888889 | 0 |
| 0.8333333333333334 | 0 |
| 0.8340277777777777 | 0 |
| 0.8347222222222223 | 0 |
| 0.8354166666666667 | 0 |
| 0.8361111111111111 | 0 |
| 0.8368055555555555 | 0 |
| 0.8375 | 0 |
| 0.8381944444444445 | 0 |
| 0.8388888888888889 | 0 |
| 0.8395833333333332 | 0 |
| 0.8402777777777778 | 0 |
| 0.8409722222222222 | 0 |
| 0.8416666666666667 | 0 |
| 0.842361111111111 | 0 |
| 0.8430555555555556 | 0 |
| 0.84375 | 0 |
| 0.8444444444444444 | 0 |
| 0.845138888888889 | 0 |
| 0.8458333333333333 | 0 |
| 0.8465277777777778 | 0 |
| 0.8472222222222222 | 0 |
| 0.8479166666666668 | 0 |
| 0.8486111111111111 | 0 |
| 0.8493055555555555 | 0 |
| 0.85 | 0 |
| 0.8506944444444445 | 0 |
| 0.8513888888888889 | 0 |
| 0.8520833333333333 | 0 |
| 0.8527777777777777 | 0 |
| 0.8534722222222223 | 0 |
| 0.8541666666666666 | 0 |
| 0.8548611111111111 | 0 |
| 0.8555555555555556 | 0 |
| 0.8562500000000001 | 0 |
| 0.8569444444444444 | 0 |
| 0.8576388888888888 | 0 |
| 0.8583333333333334 | 0 |
| 0.8590277777777778 | 0 |
| 0.8597222222222222 | 0 |
| 0.8604166666666666 | 0 |
| 0.8611111111111112 | 0 |
| 0.8618055555555556 | 0 |
| 0.8624999999999999 | 0 |
| 0.8631944444444444 | 0 |
| 0.8638888888888889 | 0 |
| 0.8645833333333334 | 0 |
| 0.8652777777777777 | 0 |
| 0.8659722222222223 | 0 |
| 0.8666666666666667 | 0 |
| 0.8673611111111111 | 0 |
| 0.8680555555555555 | 0 |
| 0.86875 | 0 |
| 0.8694444444444445 | 0 |
| 0.8701388888888889 | 0 |
| 0.8708333333333332 | 0 |
| 0.8715277777777778 | 0 |
| 0.8722222222222222 | 0 |
| 0.8729166666666667 | 0 |
| 0.873611111111111 | 0 |
| 0.8743055555555556 | 0 |
| 0.875 | 0 |
| 0.8756944444444444 | 0 |
| 0.876388888888889 | 0 |
| 0.8770833333333333 | 0 |
| 0.8777777777777778 | 0 |
| 0.8784722222222222 | 0 |
| 0.8791666666666668 | 0 |
| 0.8798611111111111 | 0 |
| 0.8805555555555555 | 0 |
| 0.88125 | 0 |
| 0.8819444444444445 | 0 |
| 0.8826388888888889 | 0 |
| 0.8833333333333333 | 0 |
| 0.8840277777777777 | 0 |
| 0.8847222222222223 | 0 |
| 0.8854166666666666 | 0 |
| 0.8861111111111111 | 0 |
| 0.8868055555555556 | 0 |
| 0.8875000000000001 | 0 |
| 0.8881944444444444 | 0 |
| 0.8888888888888888 | 0 |
| 0.8895833333333334 | 0 |
| 0.8902777777777778 | 0 |
| 0.8909722222222222 | 0 |
| 0.8916666666666666 | 0 |
| 0.8923611111111112 | 0 |
| 0.8930555555555556 | 0 |
| 0.8937499999999999 | 0 |
| 0.8944444444444444 | 0 |
| 0.8951388888888889 | 0 |
| 0.8958333333333334 | 0 |
| 0.8965277777777777 | 0 |
| 0.8972222222222223 | 0 |
| 0.8979166666666667 | 0 |
| 0.8986111111111111 | 0 |
| 0.8993055555555555 | 0 |
| 0.9 | 0 |
| 0.9006944444444445 | 0 |
| 0.9013888888888889 | 0 |
| 0.9020833333333332 | 0 |
| 0.9027777777777778 | 0 |
| 0.9034722222222222 | 0 |
| 0.9041666666666667 | 0 |
| 0.904861111111111 | 0 |
| 0.9055555555555556 | 0 |
| 0.90625 | 0 |
| 0.9069444444444444 | 0 |
| 0.907638888888889 | 0 |
| 0.9083333333333333 | 0 |
| 0.9090277777777778 | 0 |
| 0.9097222222222222 | 0 |
| 0.9104166666666668 | 0 |
| 0.9111111111111111 | 0 |
| 0.9118055555555555 | 0 |
| 0.9125 | 0 |
| 0.9131944444444445 | 0 |
| 0.9138888888888889 | 0 |
| 0.9145833333333333 | 0 |
| 0.9152777777777777 | 0 |
| 0.9159722222222223 | 0 |
| 0.9166666666666666 | 0 |
| 0.9173611111111111 | 0 |
| 0.9180555555555556 | 0 |
| 0.9187500000000001 | 0 |
| 0.9194444444444444 | 0 |
| 0.9201388888888888 | 0 |
| 0.9208333333333334 | 0 |
| 0.9215277777777778 | 0 |
| 0.9222222222222222 | 0 |
| 0.9229166666666666 | 0 |
| 0.9236111111111112 | 0 |
| 0.9243055555555556 | 0 |
| 0.9249999999999999 | 0 |
| 0.9256944444444444 | 0 |
| 0.9263888888888889 | 0 |
| 0.9270833333333334 | 0 |
| 0.9277777777777777 | 0 |
| 0.9284722222222223 | 0 |
| 0.9291666666666667 | 0 |
| 0.9298611111111111 | 0 |
| 0.9305555555555555 | 0 |
| 0.93125 | 0 |
| 0.9319444444444445 | 0 |
| 0.9326388888888889 | 0 |
| 0.9333333333333332 | 0 |
| 0.9340277777777778 | 0 |
| 0.9347222222222222 | 0 |
| 0.9354166666666667 | 0 |
| 0.936111111111111 | 0 |
| 0.9368055555555556 | 0 |
| 0.9375 | 0 |
| 0.9381944444444444 | 0 |
| 0.938888888888889 | 0 |
| 0.9395833333333333 | 0 |
| 0.9402777777777778 | 0 |
| 0.9409722222222222 | 0 |
| 0.9416666666666668 | 0 |
| 0.9423611111111111 | 0 |
| 0.9430555555555555 | 0 |
| 0.94375 | 0 |
| 0.9444444444444445 | 0 |
| 0.9451388888888889 | 0 |
| 0.9458333333333333 | 0 |
| 0.9465277777777777 | 0 |
| 0.9472222222222223 | 0 |
| 0.9479166666666666 | 0 |
| 0.9486111111111111 | 0 |
| 0.9493055555555556 | 0 |
| 0.9500000000000001 | 0 |
| 0.9506944444444444 | 0 |
| 0.9513888888888888 | 0 |
| 0.9520833333333334 | 0 |
| 0.9527777777777778 | 0 |
| 0.9534722222222222 | 0 |
| 0.9541666666666666 | 0 |
| 0.9548611111111112 | 0 |
| 0.9555555555555556 | 0 |
| 0.9562499999999999 | 0 |
| 0.9569444444444444 | 0 |
| 0.9576388888888889 | 0 |
| 0.9583333333333334 | 0 |
| 0.9590277777777777 | 0 |
| 0.9597222222222223 | 0 |
| 0.9604166666666667 | 0 |
| 0.9611111111111111 | 0 |
| 0.9618055555555555 | 0 |
| 0.9625 | 0 |
| 0.9631944444444445 | 0 |
| 0.9638888888888889 | 0 |
| 0.9645833333333332 | 0 |
| 0.9652777777777778 | 0 |
| 0.9659722222222222 | 0 |
| 0.9666666666666667 | 0 |
| 0.967361111111111 | 0 |
| 0.9680555555555556 | 0 |
| 0.96875 | 0 |
| 0.9694444444444444 | 0 |
| 0.970138888888889 | 0 |
| 0.9708333333333333 | 0 |
| 0.9715277777777778 | 0 |
| 0.9722222222222222 | 0 |
| 0.9729166666666668 | 0 |
| 0.9736111111111111 | 0 |
| 0.9743055555555555 | 0 |
| 0.975 | 0 |
| 0.9756944444444445 | 0 |
| 0.9763888888888889 | 0 |
| 0.9770833333333333 | 0 |
| 0.9777777777777777 | 0 |
| 0.9784722222222223 | 0 |
| 0.9791666666666666 | 0 |
| 0.9798611111111111 | 0 |
| 0.9805555555555556 | 0 |
| 0.9812500000000001 | 0 |
| 0.9819444444444444 | 0 |
| 0.9826388888888888 | 0 |
| 0.9833333333333334 | 0 |
| 0.9840277777777778 | 0 |
| 0.9847222222222222 | 0 |
| 0.9854166666666666 | 0 |
| 0.9861111111111112 | 0 |
| 0.9868055555555556 | 0 |
| 0.9874999999999999 | 0 |
| 0.9881944444444444 | 0 |
| 0.9888888888888889 | 0 |
| 0.9895833333333334 | 0 |
| 0.9902777777777777 | 0 |
| 0.9909722222222223 | 0 |
| 0.9916666666666667 | 0 |
| 0.9923611111111111 | 0 |
| 0.9930555555555555 | 0 |
| 0.99375 | 0 |
| 0.9944444444444445 | 0 |
| 0.9951388888888889 | 0 |
| 0.9958333333333332 | 0 |
| 0.9965277777777778 | 0 |
| 0.9972222222222222 | 0 |
| 0.9979166666666667 | 0 |
| 0.998611111111111 | 0 |
| 0.9993055555555556 | 0 |